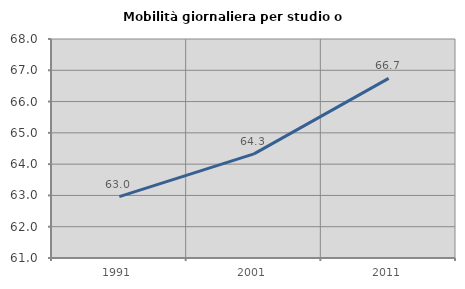
| Category | Mobilità giornaliera per studio o lavoro |
|---|---|
| 1991.0 | 62.963 |
| 2001.0 | 64.327 |
| 2011.0 | 66.742 |